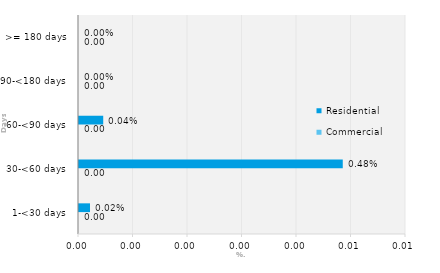
| Category | Commercial | Residential |
|---|---|---|
| 1-<30 days | 0 | 0 |
| 30-<60 days | 0 | 0.005 |
| 60-<90 days | 0 | 0 |
| 90-<180 days | 0 | 0 |
| >= 180 days | 0 | 0 |